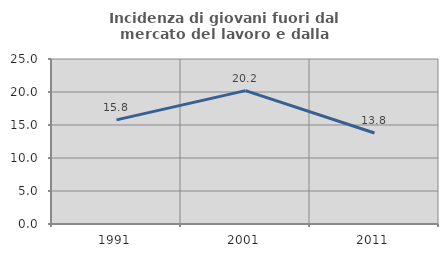
| Category | Incidenza di giovani fuori dal mercato del lavoro e dalla formazione  |
|---|---|
| 1991.0 | 15.779 |
| 2001.0 | 20.203 |
| 2011.0 | 13.784 |